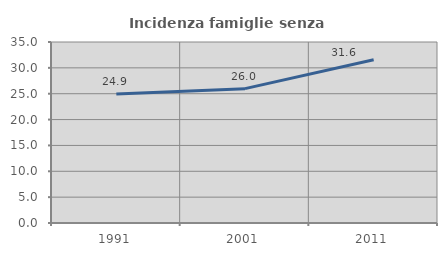
| Category | Incidenza famiglie senza nuclei |
|---|---|
| 1991.0 | 24.924 |
| 2001.0 | 25.98 |
| 2011.0 | 31.584 |